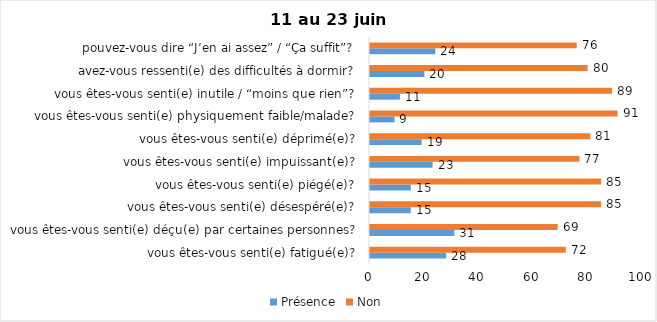
| Category | Présence | Non |
|---|---|---|
| vous êtes-vous senti(e) fatigué(e)? | 28 | 72 |
| vous êtes-vous senti(e) déçu(e) par certaines personnes? | 31 | 69 |
| vous êtes-vous senti(e) désespéré(e)? | 15 | 85 |
| vous êtes-vous senti(e) piégé(e)? | 15 | 85 |
| vous êtes-vous senti(e) impuissant(e)? | 23 | 77 |
| vous êtes-vous senti(e) déprimé(e)? | 19 | 81 |
| vous êtes-vous senti(e) physiquement faible/malade? | 9 | 91 |
| vous êtes-vous senti(e) inutile / “moins que rien”? | 11 | 89 |
| avez-vous ressenti(e) des difficultés à dormir? | 20 | 80 |
| pouvez-vous dire “J’en ai assez” / “Ça suffit”? | 24 | 76 |